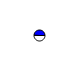
| Category | Series 0 |
|---|---|
| 0 | 1118496 |
| 1 | 1085262 |